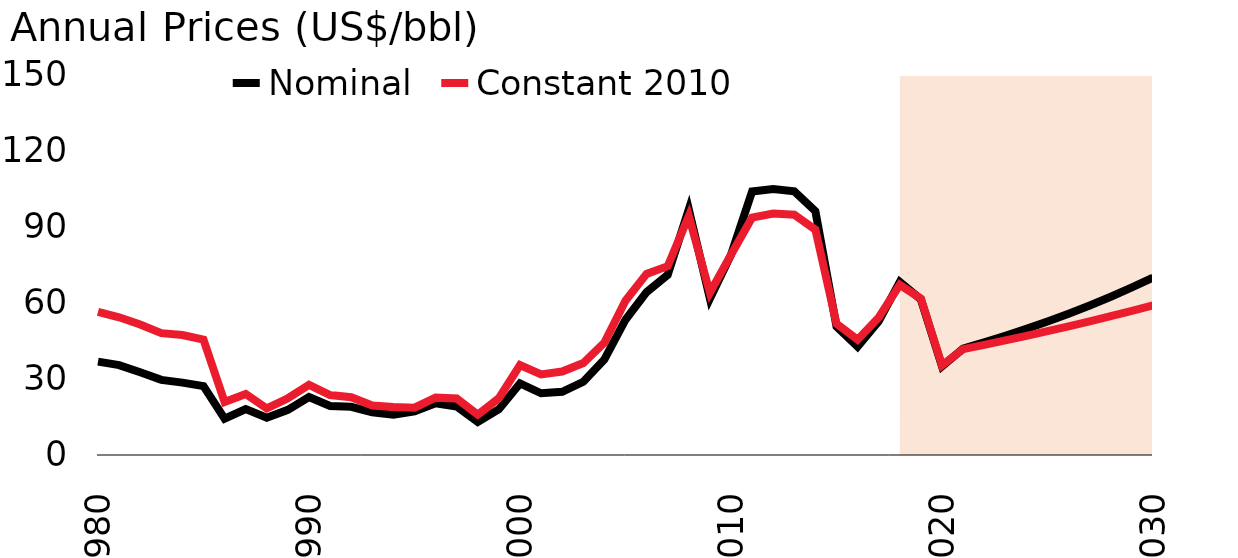
| Category | Nominal | Constant 2010 |
|---|---|---|
| 1980.0 | 36.869 | 56.526 |
| 1981.0 | 35.485 | 54.342 |
| 1982.0 | 32.647 | 51.531 |
| 1983.0 | 29.658 | 48.088 |
| 1984.0 | 28.557 | 47.346 |
| 1985.0 | 27.183 | 45.543 |
| 1986.0 | 14.35 | 20.903 |
| 1987.0 | 18.146 | 24.12 |
| 1988.0 | 14.718 | 18.372 |
| 1989.0 | 17.839 | 22.401 |
| 1990.0 | 22.879 | 27.675 |
| 1991.0 | 19.371 | 23.648 |
| 1992.0 | 19.021 | 22.795 |
| 1993.0 | 16.842 | 19.51 |
| 1994.0 | 15.887 | 18.974 |
| 1995.0 | 17.183 | 18.694 |
| 1996.0 | 20.42 | 22.646 |
| 1997.0 | 19.171 | 22.312 |
| 1998.0 | 13.064 | 15.899 |
| 1999.0 | 18.071 | 22.423 |
| 2000.0 | 28.23 | 35.482 |
| 2001.0 | 24.352 | 31.8 |
| 2002.0 | 24.928 | 32.937 |
| 2003.0 | 28.899 | 36.297 |
| 2004.0 | 37.733 | 44.379 |
| 2005.0 | 53.391 | 60.876 |
| 2006.0 | 64.288 | 71.49 |
| 2007.0 | 71.117 | 74.522 |
| 2008.0 | 96.99 | 94.318 |
| 2009.0 | 61.757 | 64.022 |
| 2010.0 | 79.041 | 79.041 |
| 2011.0 | 104.009 | 93.706 |
| 2012.0 | 105.01 | 95.312 |
| 2013.0 | 104.077 | 94.879 |
| 2014.0 | 96.235 | 88.927 |
| 2015.0 | 50.753 | 51.864 |
| 2016.0 | 42.812 | 45.528 |
| 2017.0 | 52.805 | 54.258 |
| 2018.0 | 68.348 | 67.152 |
| 2019.0 | 61.408 | 61.73 |
| 2020.0 | 35 | 35.357 |
| 2021.0 | 42 | 41.762 |
| 2022.0 | 44.453 | 43.472 |
| 2023.0 | 47.049 | 45.226 |
| 2024.0 | 49.797 | 47.029 |
| 2025.0 | 52.705 | 48.884 |
| 2026.0 | 55.783 | 50.794 |
| 2027.0 | 59.04 | 52.763 |
| 2028.0 | 62.488 | 54.792 |
| 2029.0 | 66.138 | 56.885 |
| 2030.0 | 70 | 59.042 |